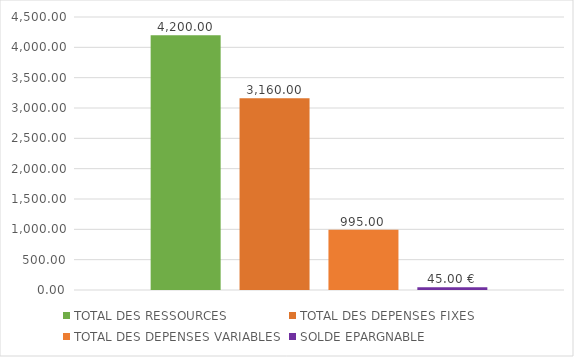
| Category | TOTAL DES RESSOURCES | TOTAL DES DEPENSES FIXES | TOTAL DES DEPENSES VARIABLES | SOLDE EPARGNABLE |
|---|---|---|---|---|
| 0 | 4200 | 3160 | 995 | 45 |